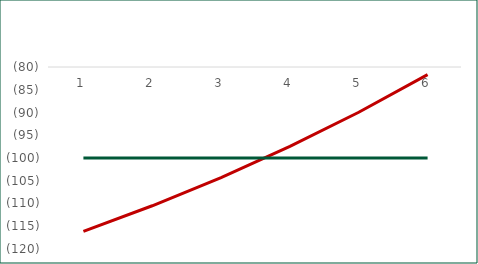
| Category | Net IncomeIFRS 16 | Net IncomeIAS 17 |
|---|---|---|
| 1.0 | -116.14 | -100 |
| 2.0 | -110.5 | -100 |
| 3.0 | -104.29 | -100 |
| 4.0 | -97.45 | -100 |
| 5.0 | -89.95 | -100 |
| 6.0 | -81.68 | -100 |